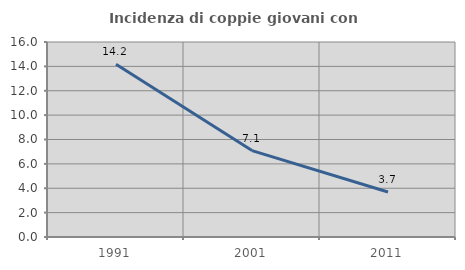
| Category | Incidenza di coppie giovani con figli |
|---|---|
| 1991.0 | 14.176 |
| 2001.0 | 7.09 |
| 2011.0 | 3.689 |